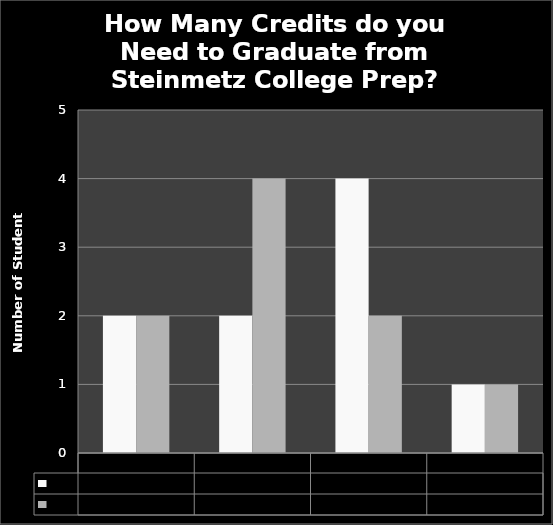
| Category | Pre  | Post |
|---|---|---|
| 20 Credits | 2 | 2 |
| 24 Credits | 2 | 4 |
| 40 Credits | 4 | 2 |
| 50 Credits | 1 | 1 |